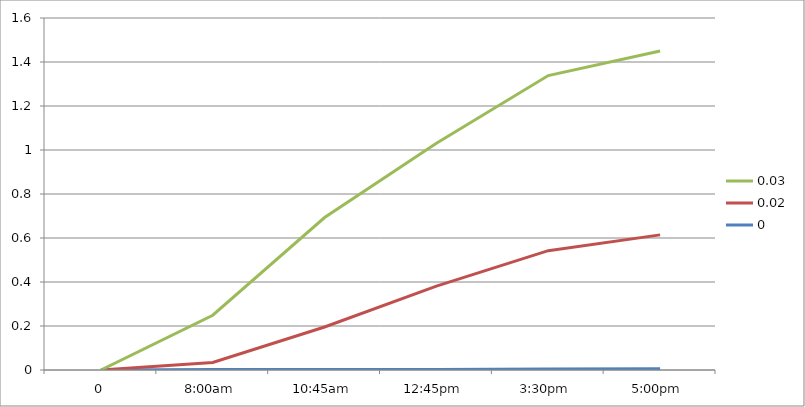
| Category | 0 | 0.02 | 0.03 |
|---|---|---|---|
| 0 | 0 | 0 | 0 |
| 8:00am | 0.002 | 0.032 | 0.215 |
| 10:45am | 0.002 | 0.194 | 0.498 |
| 12:45pm | 0.003 | 0.379 | 0.65 |
| 3:30pm | 0.005 | 0.538 | 0.796 |
| 5:00pm | 0.005 | 0.609 | 0.836 |